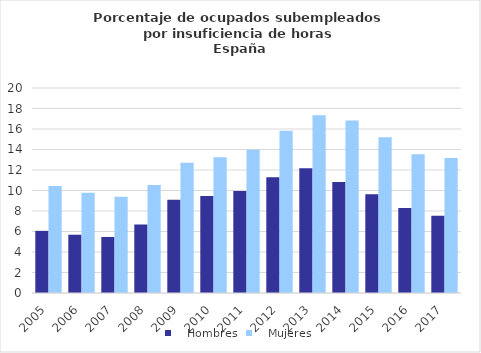
| Category |    Hombres |    Mujeres |
|---|---|---|
| 2005.0 | 6.062 | 10.438 |
| 2006.0 | 5.685 | 9.773 |
| 2007.0 | 5.467 | 9.389 |
| 2008.0 | 6.677 | 10.535 |
| 2009.0 | 9.101 | 12.7 |
| 2010.0 | 9.465 | 13.251 |
| 2011.0 | 9.945 | 13.964 |
| 2012.0 | 11.285 | 15.83 |
| 2013.0 | 12.181 | 17.353 |
| 2014.0 | 10.822 | 16.823 |
| 2015.0 | 9.637 | 15.189 |
| 2016.0 | 8.292 | 13.541 |
| 2017.0 | 7.535 | 13.167 |